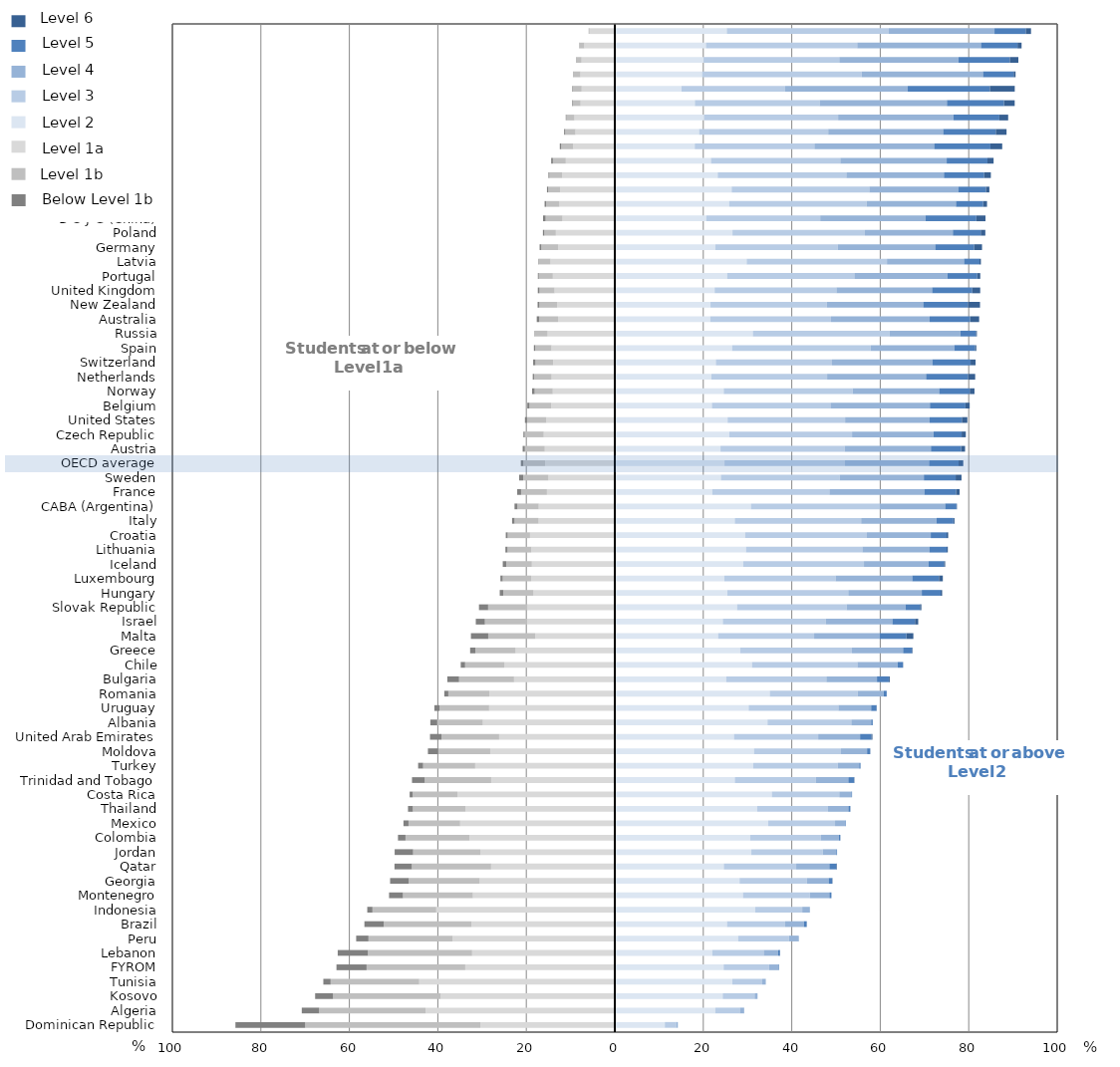
| Category | Level 1a | Series 7 | Below Level 1b | Level 2 | Level 3
 | Level 4
 | Level 5
 | Level 6
 |
|---|---|---|---|---|---|---|---|---|
| Viet Nam | -5.683 | -0.232 | -0.008 | 25.313 | 36.617 | 23.893 | 7.064 | 1.191 |
| Macao (China) | -6.897 | -1.101 | -0.058 | 20.604 | 34.189 | 27.975 | 8.256 | 0.919 |
| Estonia | -7.516 | -1.24 | -0.027 | 20.079 | 30.67 | 26.928 | 11.606 | 1.933 |
| Hong Kong (China) | -7.772 | -1.555 | -0.086 | 19.727 | 36.094 | 27.404 | 6.92 | 0.442 |
| Singapore | -7.492 | -1.954 | -0.153 | 15.091 | 23.409 | 27.72 | 18.56 | 5.621 |
| Japan | -7.737 | -1.719 | -0.156 | 18.098 | 28.193 | 28.781 | 12.9 | 2.415 |
| Canada | -9.128 | -1.813 | -0.145 | 20.199 | 30.282 | 26.072 | 10.368 | 1.994 |
| Finland | -8.896 | -2.305 | -0.254 | 19.051 | 29.192 | 25.98 | 11.888 | 2.434 |
| Chinese Taipei | -9.402 | -2.707 | -0.325 | 18.071 | 27.047 | 27.069 | 12.713 | 2.666 |
| Korea | -11.082 | -2.906 | -0.394 | 21.739 | 29.235 | 24.042 | 9.217 | 1.385 |
| Slovenia | -11.94 | -2.844 | -0.219 | 23.263 | 29.072 | 22.064 | 9.092 | 1.507 |
| Ireland | -12.371 | -2.679 | -0.281 | 26.417 | 31.114 | 20.085 | 6.285 | 0.767 |
| Denmark | -12.525 | -3 | -0.343 | 25.851 | 31.092 | 20.176 | 6.144 | 0.869 |
| B-S-J-G (China) | -11.827 | -3.813 | -0.579 | 20.667 | 25.767 | 23.778 | 11.496 | 2.073 |
| Poland | -13.326 | -2.601 | -0.324 | 26.603 | 29.921 | 19.893 | 6.297 | 1.035 |
| Germany | -12.767 | -3.836 | -0.393 | 22.746 | 27.669 | 22.004 | 8.8 | 1.785 |
| Latvia | -14.541 | -2.581 | -0.127 | 29.807 | 31.707 | 17.428 | 3.492 | 0.317 |
| Portugal | -14.004 | -3.181 | -0.206 | 25.39 | 28.754 | 21.033 | 6.745 | 0.687 |
| United Kingdom | -13.615 | -3.408 | -0.382 | 22.569 | 27.528 | 21.626 | 9.078 | 1.795 |
| New Zealand | -13.038 | -4.011 | -0.4 | 21.631 | 26.308 | 21.772 | 10.102 | 2.738 |
| Australia | -12.827 | -4.254 | -0.565 | 21.568 | 27.296 | 22.303 | 9.151 | 2.036 |
| Russia | -15.196 | -2.857 | -0.104 | 31.208 | 30.865 | 16.024 | 3.519 | 0.226 |
| Spain | -14.309 | -3.666 | -0.313 | 26.512 | 31.325 | 18.896 | 4.673 | 0.306 |
| Switzerland | -13.929 | -4.009 | -0.517 | 22.84 | 26.256 | 22.677 | 8.641 | 1.131 |
| Netherlands | -14.285 | -3.972 | -0.288 | 21.846 | 26.146 | 22.362 | 9.495 | 1.606 |
| Norway | -14.025 | -4.093 | -0.583 | 24.625 | 29.134 | 19.558 | 6.91 | 1.07 |
| Belgium | -14.369 | -4.923 | -0.492 | 21.949 | 26.794 | 22.486 | 8.032 | 0.956 |
| United States | -15.497 | -4.34 | -0.478 | 25.499 | 26.556 | 19.114 | 7.28 | 1.236 |
| Czech Republic | -16.066 | -4.302 | -0.291 | 25.9 | 27.728 | 18.417 | 6.349 | 0.948 |
| Austria | -15.83 | -4.501 | -0.496 | 23.892 | 28.062 | 19.499 | 6.812 | 0.908 |
| OECD average | -15.736 | -4.914 | -0.591 | 24.796 | 27.228 | 19.012 | 6.667 | 1.055 |
| Sweden | -15.008 | -5.693 | -0.933 | 23.977 | 26.835 | 19.049 | 7.179 | 1.326 |
| France | -15.341 | -5.844 | -0.875 | 22.03 | 26.476 | 21.447 | 7.181 | 0.805 |
| CABA (Argentina) | -17.197 | -4.821 | -0.651 | 30.768 | 29.047 | 14.851 | 2.562 | 0.103 |
| Italy | -17.22 | -5.445 | -0.555 | 27.124 | 28.554 | 17.02 | 3.839 | 0.243 |
| Croatia | -19.162 | -5.051 | -0.43 | 29.459 | 27.518 | 14.436 | 3.584 | 0.359 |
| Lithuania | -18.871 | -5.378 | -0.48 | 29.659 | 26.293 | 15.144 | 3.913 | 0.262 |
| Iceland | -18.746 | -5.794 | -0.789 | 29.032 | 27.285 | 14.592 | 3.487 | 0.275 |
| Luxembourg | -18.914 | -6.418 | -0.525 | 24.772 | 25.143 | 17.315 | 6.04 | 0.873 |
| Hungary | -18.378 | -6.823 | -0.806 | 25.452 | 27.317 | 16.623 | 4.262 | 0.339 |
| Slovak Republic | -19.732 | -8.903 | -2.071 | 27.635 | 24.759 | 13.31 | 3.273 | 0.317 |
| Israel | -19.877 | -9.491 | -2.052 | 24.42 | 23.297 | 15.024 | 5.11 | 0.73 |
| Malta | -17.977 | -10.637 | -3.907 | 23.354 | 21.702 | 14.784 | 6.081 | 1.559 |
| Greece | -22.419 | -9.103 | -1.18 | 28.35 | 25.246 | 11.571 | 2.007 | 0.125 |
| Chile | -24.99 | -8.852 | -0.983 | 31.012 | 23.82 | 9.104 | 1.199 | 0.04 |
| Bulgaria | -22.778 | -12.427 | -2.655 | 25.178 | 22.641 | 11.437 | 2.667 | 0.218 |
| Romania | -28.365 | -9.266 | -0.913 | 35.033 | 19.873 | 5.876 | 0.668 | 0.006 |
| Uruguay | -28.409 | -11.218 | -1.161 | 30.259 | 20.283 | 7.397 | 1.217 | 0.056 |
| Albania | -29.829 | -10.297 | -1.572 | 34.518 | 18.936 | 4.496 | 0.342 | 0.01 |
| United Arab Emirates | -26.146 | -13.023 | -2.602 | 26.94 | 19.03 | 9.468 | 2.54 | 0.249 |
| Moldova | -28.159 | -11.782 | -2.301 | 31.464 | 19.663 | 5.891 | 0.704 | 0.035 |
| Turkey | -31.559 | -11.774 | -1.123 | 31.289 | 19.118 | 4.844 | 0.289 | 0.005 |
| Trinidad and Tobago | -27.943 | -15.021 | -2.878 | 27.129 | 18.325 | 7.329 | 1.306 | 0.07 |
| Costa Rica | -35.573 | -10.104 | -0.696 | 35.499 | 15.237 | 2.742 | 0.146 | 0.002 |
| Thailand | -33.727 | -11.922 | -1.098 | 32.182 | 16.002 | 4.612 | 0.448 | 0.01 |
| Mexico | -34.965 | -11.667 | -1.136 | 34.685 | 15.097 | 2.33 | 0.12 | 0 |
| Colombia | -32.826 | -14.488 | -1.696 | 30.608 | 15.925 | 4.104 | 0.345 | 0.006 |
| Jordan | -30.394 | -15.199 | -4.169 | 30.865 | 16.137 | 3.068 | 0.167 | 0 |
| Qatar | -27.959 | -17.929 | -3.912 | 24.644 | 16.356 | 7.503 | 1.562 | 0.135 |
| Georgia | -30.539 | -16.033 | -4.22 | 28.207 | 15.22 | 4.91 | 0.81 | 0.061 |
| Montenegro | -32.083 | -15.808 | -3.138 | 28.974 | 15.131 | 4.402 | 0.455 | 0.008 |
| Indonesia | -40.358 | -14.42 | -1.176 | 31.747 | 10.623 | 1.576 | 0.101 | 0 |
| Brazil | -32.373 | -19.85 | -4.375 | 25.361 | 13.148 | 4.22 | 0.649 | 0.024 |
| Peru | -36.671 | -19.01 | -2.781 | 27.877 | 11.496 | 2.044 | 0.121 | 0 |
| Lebanon | -32.252 | -23.558 | -6.823 | 22.038 | 11.614 | 3.275 | 0.396 | 0.044 |
| FYROM | -33.804 | -22.304 | -6.806 | 24.599 | 10.268 | 2.027 | 0.183 | 0.008 |
| Tunisia | -44.215 | -20.02 | -1.649 | 26.57 | 6.757 | 0.749 | 0.039 | 0 |
| Kosovo | -39.331 | -24.359 | -4.049 | 24.393 | 7.207 | 0.652 | 0.009 | 0 |
| Algeria | -42.766 | -24.064 | -3.929 | 22.699 | 5.569 | 0.943 | 0.031 | 0 |
| Dominican Republic | -30.39 | -39.6 | -15.759 | 11.305 | 2.596 | 0.339 | 0.011 | 0 |